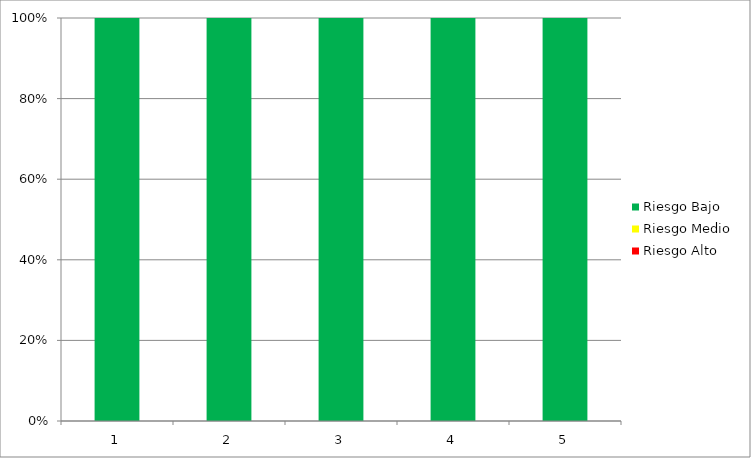
| Category | Riesgo Alto | Riesgo Medio | Riesgo Bajo |
|---|---|---|---|
| 1.0 | 0 | 0 | 100 |
| 2.0 | 0 | 0 | 100 |
| 3.0 | 0 | 0 | 100 |
| 4.0 | 0 | 0 | 100 |
| 5.0 | 0 | 0 | 100 |